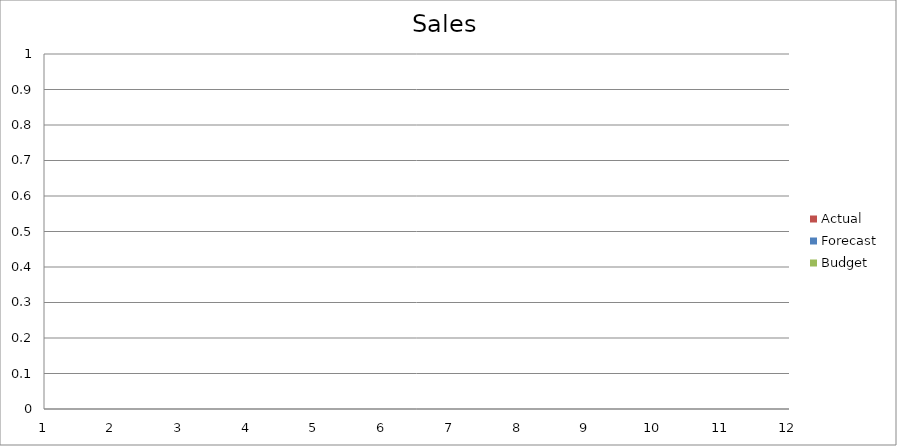
| Category | Budget | Forecast | Actual |
|---|---|---|---|
| 0 | 3160 | 2730 | 610 |
| 1 | 790 | 550 | 940 |
| 2 | 1390 | 740 | 2780 |
| 3 | 1330 | 2250 | 1760 |
| 4 | 2790 | 2590 | 1830 |
| 5 | 770 | 3380 | 900 |
| 6 | 940 | 1910 | 3210 |
| 7 | 3180 | 2960 | 1280 |
| 8 | 2250 | 1720 | 2760 |
| 9 | 1600 | 1920 | 1040 |
| 10 | 2030 | 1150 | 3230 |
| 11 | 1120 | 2820 | 2430 |